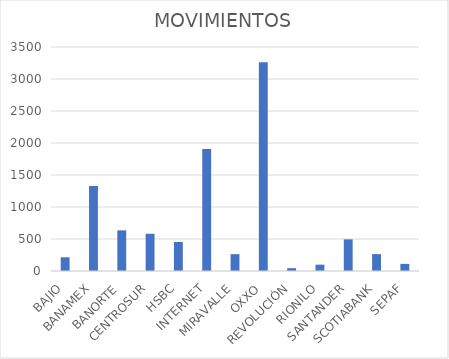
| Category | MOVIMIENTOS |
|---|---|
| BAJIO | 214 |
| BANAMEX | 1329 |
| BANORTE | 635 |
| CENTROSUR | 582 |
| HSBC | 453 |
| INTERNET | 1907 |
| MIRAVALLE | 263 |
| OXXO | 3261 |
| REVOLUCIÓN | 44 |
| RIONILO | 99 |
| SANTANDER | 494 |
| SCOTIABANK | 264 |
| SEPAF | 111 |